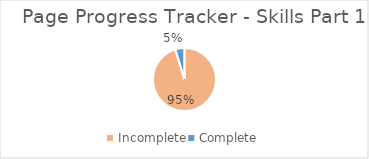
| Category | 95% |
|---|---|
| Incomplete | 0.952 |
| Complete | 0.048 |